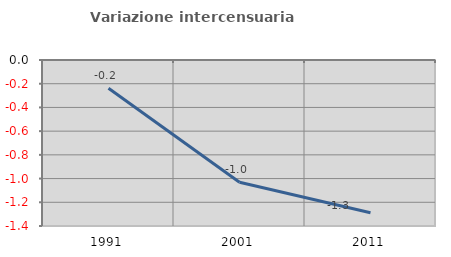
| Category | Variazione intercensuaria annua |
|---|---|
| 1991.0 | -0.238 |
| 2001.0 | -1.031 |
| 2011.0 | -1.288 |